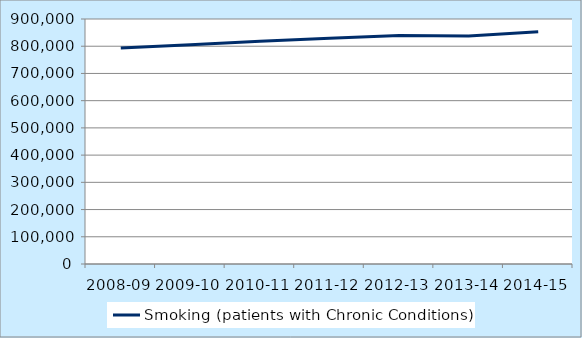
| Category | Smoking (patients with Chronic Conditions) |
|---|---|
| 2008-09 | 793154 |
| 2009-10 | 805502 |
| 2010-11 | 817891 |
| 2011-12 | 829532 |
| 2012-13 | 839213 |
| 2013-14 | 837729 |
| 2014-15 | 853552 |